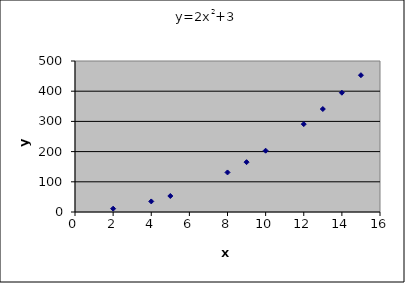
| Category | y=2x2+3 |
|---|---|
| 2.0 | 11 |
| 4.0 | 35 |
| 5.0 | 53 |
| 8.0 | 131 |
| 9.0 | 165 |
| 10.0 | 203 |
| 12.0 | 291 |
| 13.0 | 341 |
| 14.0 | 395 |
| 15.0 | 453 |